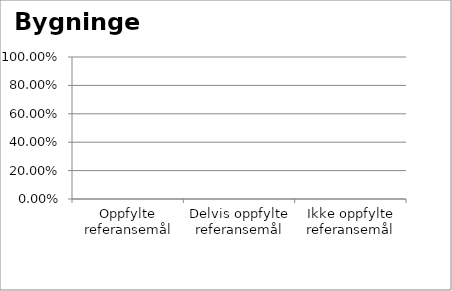
| Category | Bygninger |
|---|---|
| Oppfylte referansemål | 0 |
| Delvis oppfylte referansemål | 0 |
| Ikke oppfylte referansemål | 0 |